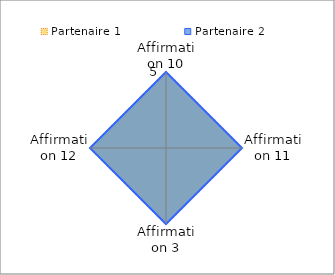
| Category | Partenaire 1 | Partenaire 2 |
|---|---|---|
| Affirmation 10 | 5 | 5 |
| Affirmation 11 | 5 | 5 |
| Affirmation 3 | 5 | 5 |
| Affirmation 12 | 5 | 5 |